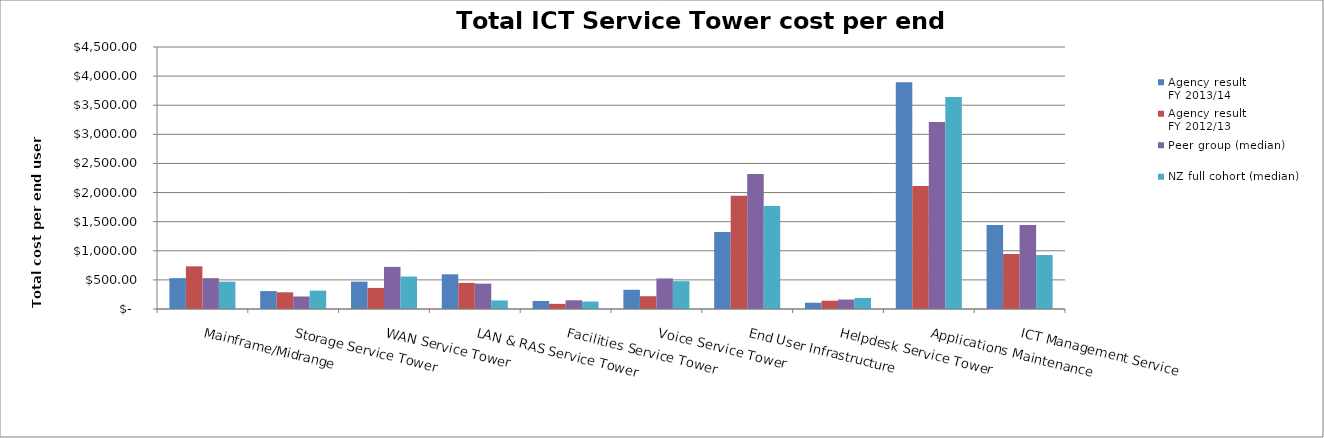
| Category | Agency result
FY 2013/14 | Agency result
FY 2012/13 | Peer group (median) | NZ full cohort (median) |
|---|---|---|---|---|
| Mainframe/Midrange | 530 | 732.759 | 530 | 469.179 |
| Storage Service Tower | 308 | 286.638 | 214.706 | 315.592 |
| WAN Service Tower | 470 | 362.069 | 723.577 | 557.006 |
| LAN & RAS Service Tower | 596 | 448.276 | 435.484 | 146.525 |
| Facilities Service Tower | 138 | 88.362 | 150 | 128.765 |
| Voice Service Tower | 330 | 219.828 | 524.496 | 477.695 |
| End User Infrastructure | 1322 | 1946.121 | 2317.003 | 1770.401 |
| Helpdesk Service Tower | 108 | 142.241 | 162.602 | 189.812 |
| Applications Maintenance | 3896 | 2112.069 | 3212.5 | 3639.154 |
| ICT Management Service | 1444 | 943.966 | 1444 | 927.742 |